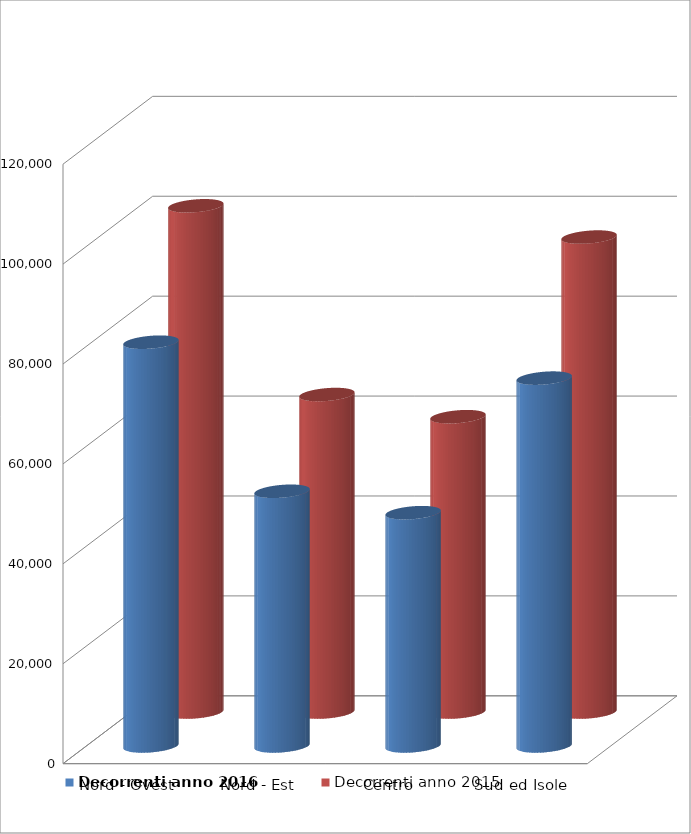
| Category | Decorrenti anno 2016 | Decorrenti anno 2015 |
|---|---|---|
| Nord - Ovest | 80823 | 101333 |
| Nord - Est | 50982 | 63554 |
| Centro | 46695 | 59115 |
| Sud ed Isole | 73631 | 95075 |